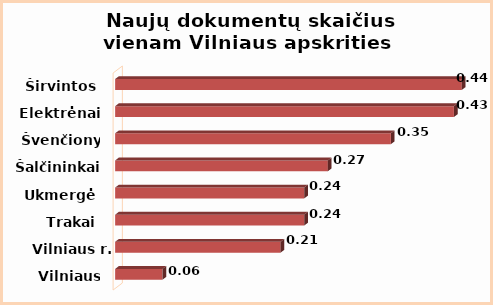
| Category | Series 0 |
|---|---|
| Vilniaus m. | 0.06 |
| Vilniaus r. | 0.21 |
| Trakai | 0.24 |
| Ukmergė | 0.24 |
| Šalčininkai | 0.27 |
| Švenčionys | 0.35 |
| Elektrėnai | 0.43 |
| Širvintos | 0.44 |